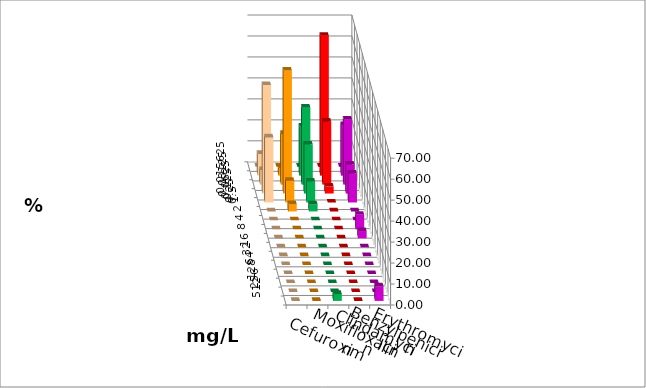
| Category | Cefuroxim | Moxifloxacin | Clindamycin | Benzylpenicillin | Erythromycin |
|---|---|---|---|---|---|
| 0.015625 | 0 | 0 | 0 | 0 | 0 |
| 0.03125 | 10.345 | 3.448 | 23.333 | 66.667 | 24.138 |
| 0.0625 | 6.897 | 24.138 | 36.667 | 30 | 31.034 |
| 0.125 | 51.724 | 58.621 | 23.333 | 3.333 | 13.793 |
| 0.25 | 31.034 | 10.345 | 10 | 0 | 13.793 |
| 0.5 | 0 | 3.448 | 3.333 | 0 | 0 |
| 1.0 | 0 | 0 | 0 | 0 | 0 |
| 2.0 | 0 | 0 | 0 | 0 | 6.897 |
| 4.0 | 0 | 0 | 0 | 0 | 3.448 |
| 8.0 | 0 | 0 | 0 | 0 | 0 |
| 16.0 | 0 | 0 | 0 | 0 | 0 |
| 32.0 | 0 | 0 | 0 | 0 | 0 |
| 64.0 | 0 | 0 | 0 | 0 | 0 |
| 128.0 | 0 | 0 | 0 | 0 | 0 |
| 256.0 | 0 | 0 | 0 | 0 | 0 |
| 512.0 | 0 | 0 | 3.333 | 0 | 6.897 |